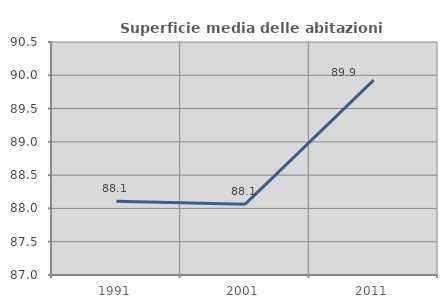
| Category | Superficie media delle abitazioni occupate |
|---|---|
| 1991.0 | 88.109 |
| 2001.0 | 88.061 |
| 2011.0 | 89.927 |